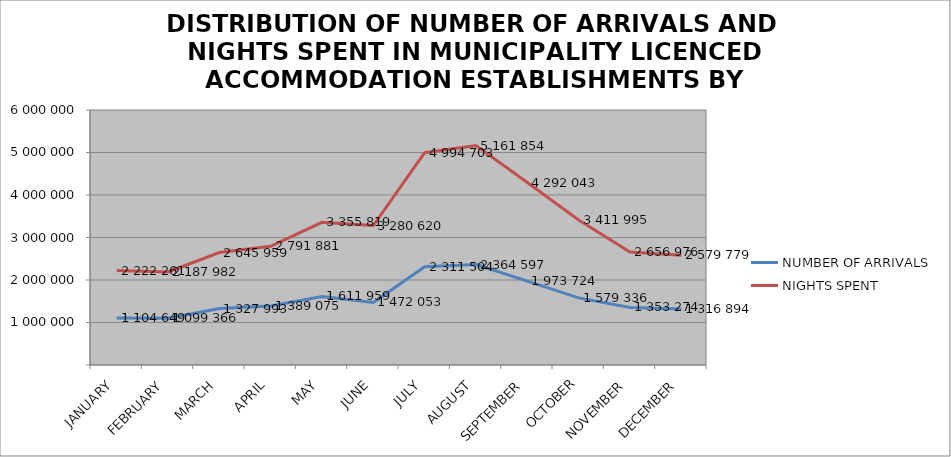
| Category | NUMBER OF ARRIVALS | NIGHTS SPENT |
|---|---|---|
| JANUARY | 1104649 | 2222261 |
| FEBRUARY | 1099366 | 2187982 |
| MARCH | 1327993 | 2645959 |
| APRIL | 1389075 | 2791881 |
| MAY | 1611959 | 3355819 |
| JUNE | 1472053 | 3280620 |
| JULY | 2311504 | 4994703 |
| AUGUST | 2364597 | 5161854 |
| SEPTEMBER | 1973724 | 4292043 |
| OCTOBER | 1579336 | 3411995 |
| NOVEMBER | 1353274 | 2656976 |
| DECEMBER | 1316894 | 2579779 |